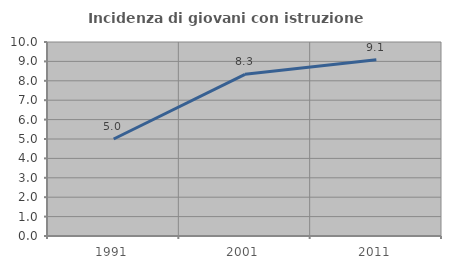
| Category | Incidenza di giovani con istruzione universitaria |
|---|---|
| 1991.0 | 5 |
| 2001.0 | 8.333 |
| 2011.0 | 9.091 |